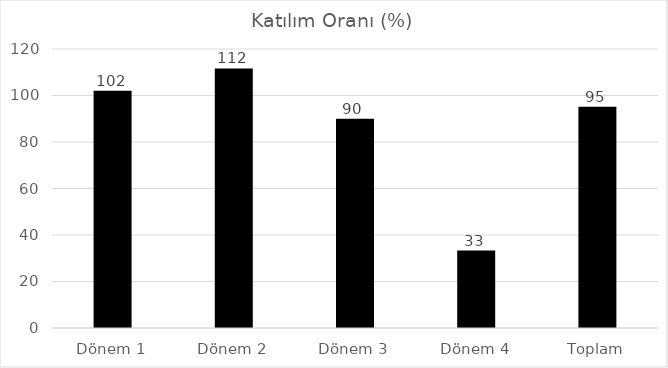
| Category | Katılım Oranı (%) |
|---|---|
| Dönem 1 | 102 |
| Dönem 2 | 111.628 |
| Dönem 3 | 90 |
| Dönem 4 | 33.333 |
| Toplam | 95.139 |